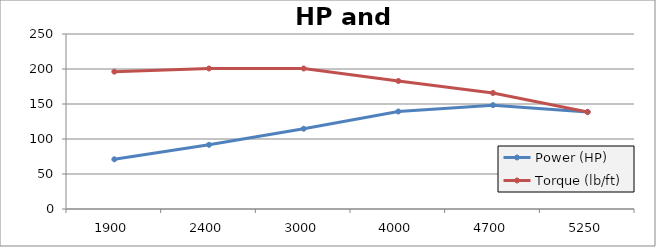
| Category | Power (HP) | Torque (lb/ft) |
|---|---|---|
| 1900.0 | 70.988 | 196.225 |
| 2400.0 | 91.725 | 200.726 |
| 3000.0 | 114.657 | 200.726 |
| 4000.0 | 139.287 | 182.883 |
| 4700.0 | 148.337 | 165.759 |
| 5250.0 | 138.582 | 138.634 |